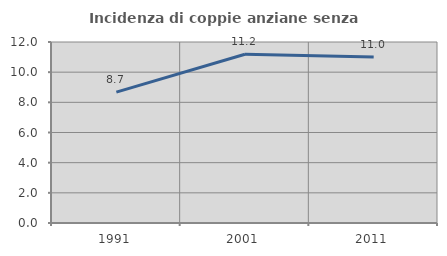
| Category | Incidenza di coppie anziane senza figli  |
|---|---|
| 1991.0 | 8.675 |
| 2001.0 | 11.191 |
| 2011.0 | 11.011 |